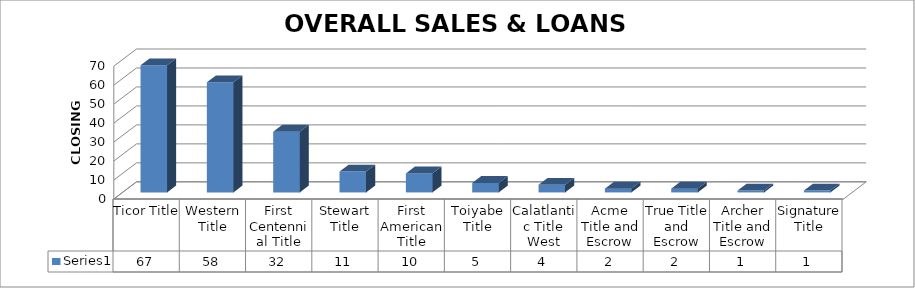
| Category | Series 0 |
|---|---|
| Ticor Title | 67 |
| Western Title | 58 |
| First Centennial Title | 32 |
| Stewart Title | 11 |
| First American Title | 10 |
| Toiyabe Title | 5 |
| Calatlantic Title West | 4 |
| Acme Title and Escrow | 2 |
| True Title and Escrow | 2 |
| Archer Title and Escrow | 1 |
| Signature Title | 1 |